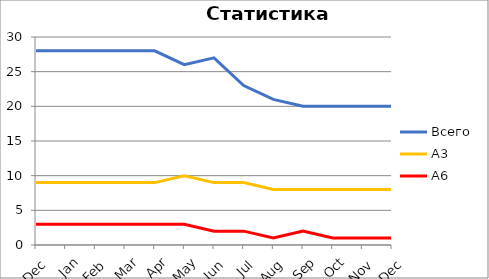
| Category | Всего | А3 | A6 |
|---|---|---|---|
| 0 | 28 | 9 | 3 |
| 1 | 28 | 9 | 3 |
| 2 | 28 | 9 | 3 |
| 3 | 28 | 9 | 3 |
| 4 | 28 | 9 | 3 |
| 5 | 26 | 10 | 3 |
| 6 | 27 | 9 | 2 |
| 7 | 23 | 9 | 2 |
| 8 | 21 | 8 | 1 |
| 9 | 20 | 8 | 2 |
| 10 | 20 | 8 | 1 |
| 11 | 20 | 8 | 1 |
| 12 | 20 | 8 | 1 |